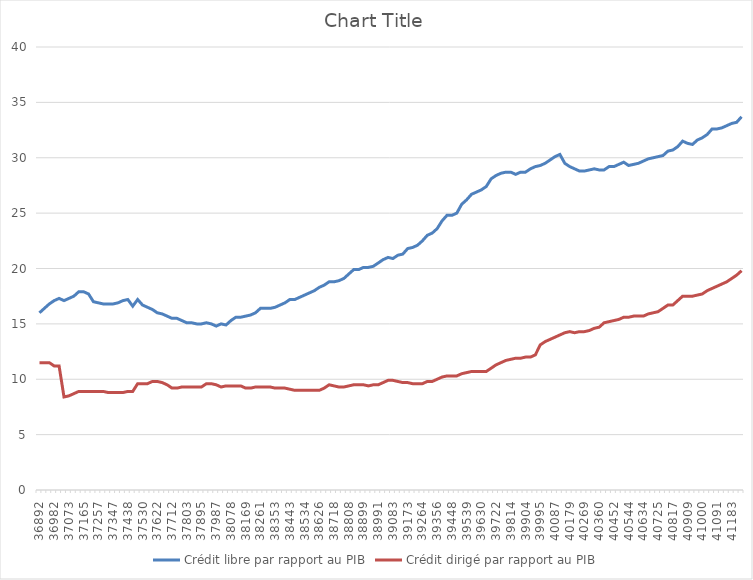
| Category | Crédit libre par rapport au PIB | Crédit dirigé par rapport au PIB |
|---|---|---|
| 36892.0 | 16 | 11.5 |
| 36923.0 | 16.4 | 11.5 |
| 36951.0 | 16.8 | 11.5 |
| 36982.0 | 17.1 | 11.2 |
| 37012.0 | 17.3 | 11.2 |
| 37043.0 | 17.1 | 8.4 |
| 37073.0 | 17.3 | 8.5 |
| 37104.0 | 17.5 | 8.7 |
| 37135.0 | 17.9 | 8.9 |
| 37165.0 | 17.9 | 8.9 |
| 37196.0 | 17.7 | 8.9 |
| 37226.0 | 17 | 8.9 |
| 37257.0 | 16.9 | 8.9 |
| 37288.0 | 16.8 | 8.9 |
| 37316.0 | 16.8 | 8.8 |
| 37347.0 | 16.8 | 8.8 |
| 37377.0 | 16.9 | 8.8 |
| 37408.0 | 17.1 | 8.8 |
| 37438.0 | 17.2 | 8.9 |
| 37469.0 | 16.6 | 8.9 |
| 37500.0 | 17.2 | 9.6 |
| 37530.0 | 16.7 | 9.6 |
| 37561.0 | 16.5 | 9.6 |
| 37591.0 | 16.3 | 9.8 |
| 37622.0 | 16 | 9.8 |
| 37653.0 | 15.9 | 9.7 |
| 37681.0 | 15.7 | 9.5 |
| 37712.0 | 15.5 | 9.2 |
| 37742.0 | 15.5 | 9.2 |
| 37773.0 | 15.3 | 9.3 |
| 37803.0 | 15.1 | 9.3 |
| 37834.0 | 15.1 | 9.3 |
| 37865.0 | 15 | 9.3 |
| 37895.0 | 15 | 9.3 |
| 37926.0 | 15.1 | 9.6 |
| 37956.0 | 15 | 9.6 |
| 37987.0 | 14.8 | 9.5 |
| 38018.0 | 15 | 9.3 |
| 38047.0 | 14.9 | 9.4 |
| 38078.0 | 15.3 | 9.4 |
| 38108.0 | 15.6 | 9.4 |
| 38139.0 | 15.6 | 9.4 |
| 38169.0 | 15.7 | 9.2 |
| 38200.0 | 15.8 | 9.2 |
| 38231.0 | 16 | 9.3 |
| 38261.0 | 16.4 | 9.3 |
| 38292.0 | 16.4 | 9.3 |
| 38322.0 | 16.4 | 9.3 |
| 38353.0 | 16.5 | 9.2 |
| 38384.0 | 16.7 | 9.2 |
| 38412.0 | 16.9 | 9.2 |
| 38443.0 | 17.2 | 9.1 |
| 38473.0 | 17.2 | 9 |
| 38504.0 | 17.4 | 9 |
| 38534.0 | 17.6 | 9 |
| 38565.0 | 17.8 | 9 |
| 38596.0 | 18 | 9 |
| 38626.0 | 18.3 | 9 |
| 38657.0 | 18.5 | 9.2 |
| 38687.0 | 18.8 | 9.5 |
| 38718.0 | 18.8 | 9.4 |
| 38749.0 | 18.9 | 9.3 |
| 38777.0 | 19.1 | 9.3 |
| 38808.0 | 19.5 | 9.4 |
| 38838.0 | 19.9 | 9.5 |
| 38869.0 | 19.9 | 9.5 |
| 38899.0 | 20.1 | 9.5 |
| 38930.0 | 20.1 | 9.4 |
| 38961.0 | 20.2 | 9.5 |
| 38991.0 | 20.5 | 9.5 |
| 39022.0 | 20.8 | 9.7 |
| 39052.0 | 21 | 9.9 |
| 39083.0 | 20.9 | 9.9 |
| 39114.0 | 21.2 | 9.8 |
| 39142.0 | 21.3 | 9.7 |
| 39173.0 | 21.8 | 9.7 |
| 39203.0 | 21.9 | 9.6 |
| 39234.0 | 22.1 | 9.6 |
| 39264.0 | 22.5 | 9.6 |
| 39295.0 | 23 | 9.8 |
| 39326.0 | 23.2 | 9.8 |
| 39356.0 | 23.6 | 10 |
| 39387.0 | 24.3 | 10.2 |
| 39417.0 | 24.8 | 10.3 |
| 39448.0 | 24.8 | 10.3 |
| 39479.0 | 25 | 10.3 |
| 39508.0 | 25.8 | 10.5 |
| 39539.0 | 26.2 | 10.6 |
| 39569.0 | 26.7 | 10.7 |
| 39600.0 | 26.9 | 10.7 |
| 39630.0 | 27.1 | 10.7 |
| 39661.0 | 27.4 | 10.7 |
| 39692.0 | 28.1 | 11 |
| 39722.0 | 28.4 | 11.3 |
| 39753.0 | 28.6 | 11.5 |
| 39783.0 | 28.7 | 11.7 |
| 39814.0 | 28.7 | 11.8 |
| 39845.0 | 28.5 | 11.9 |
| 39873.0 | 28.7 | 11.9 |
| 39904.0 | 28.7 | 12 |
| 39934.0 | 29 | 12 |
| 39965.0 | 29.2 | 12.2 |
| 39995.0 | 29.3 | 13.1 |
| 40026.0 | 29.5 | 13.4 |
| 40057.0 | 29.8 | 13.6 |
| 40087.0 | 30.1 | 13.8 |
| 40118.0 | 30.3 | 14 |
| 40148.0 | 29.5 | 14.2 |
| 40179.0 | 29.2 | 14.3 |
| 40210.0 | 29 | 14.2 |
| 40238.0 | 28.8 | 14.3 |
| 40269.0 | 28.8 | 14.3 |
| 40299.0 | 28.9 | 14.4 |
| 40330.0 | 29 | 14.6 |
| 40360.0 | 28.9 | 14.7 |
| 40391.0 | 28.9 | 15.1 |
| 40422.0 | 29.2 | 15.2 |
| 40452.0 | 29.2 | 15.3 |
| 40483.0 | 29.4 | 15.4 |
| 40513.0 | 29.6 | 15.6 |
| 40544.0 | 29.3 | 15.6 |
| 40575.0 | 29.4 | 15.7 |
| 40603.0 | 29.5 | 15.7 |
| 40634.0 | 29.7 | 15.7 |
| 40664.0 | 29.9 | 15.9 |
| 40695.0 | 30 | 16 |
| 40725.0 | 30.1 | 16.1 |
| 40756.0 | 30.2 | 16.4 |
| 40787.0 | 30.6 | 16.7 |
| 40817.0 | 30.7 | 16.7 |
| 40848.0 | 31 | 17.1 |
| 40878.0 | 31.5 | 17.5 |
| 40909.0 | 31.3 | 17.5 |
| 40940.0 | 31.2 | 17.5 |
| 40969.0 | 31.6 | 17.6 |
| 41000.0 | 31.8 | 17.7 |
| 41030.0 | 32.1 | 18 |
| 41061.0 | 32.6 | 18.2 |
| 41091.0 | 32.6 | 18.4 |
| 41122.0 | 32.7 | 18.6 |
| 41153.0 | 32.9 | 18.8 |
| 41183.0 | 33.1 | 19.1 |
| 41214.0 | 33.2 | 19.4 |
| 41244.0 | 33.7 | 19.8 |